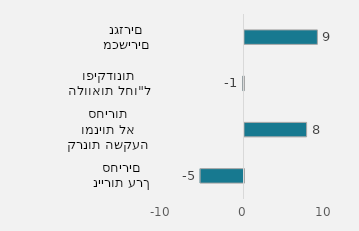
| Category | 2022 |
|---|---|
| ניירות ערך סחירים | -5380 |
| קרנות השקעה ומניות לא סחירות | 7620 |
| הלוואות לחו"ל ופיקדונות | -170 |
| מכשירים נגזרים | 8943 |